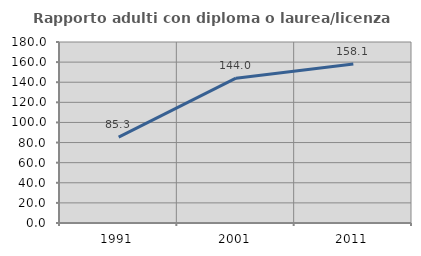
| Category | Rapporto adulti con diploma o laurea/licenza media  |
|---|---|
| 1991.0 | 85.319 |
| 2001.0 | 144.036 |
| 2011.0 | 158.118 |